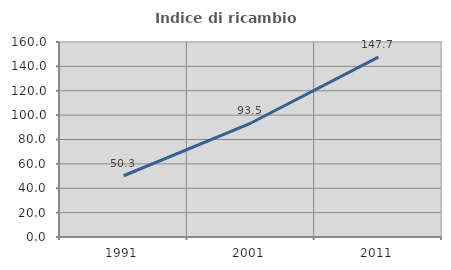
| Category | Indice di ricambio occupazionale  |
|---|---|
| 1991.0 | 50.265 |
| 2001.0 | 93.525 |
| 2011.0 | 147.656 |